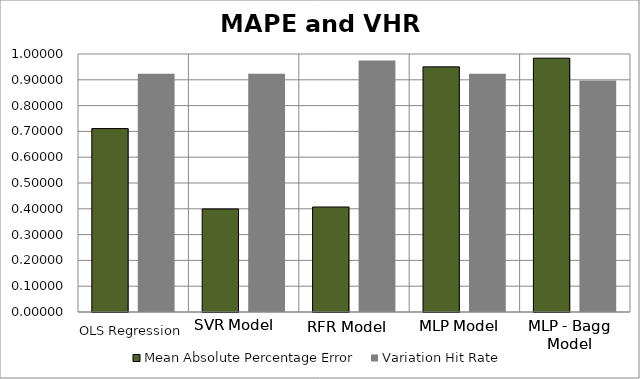
| Category | Mean Absolute Percentage Error | Variation Hit Rate |
|---|---|---|
| 0 | 0.711 | 0.923 |
| 1 | 0.399 | 0.923 |
| 2 | 0.407 | 0.974 |
| 3 | 0.95 | 0.923 |
| 4 | 0.984 | 0.897 |